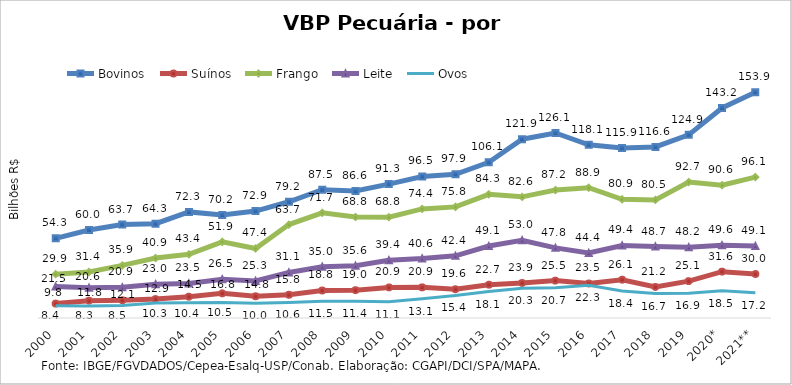
| Category | Bovinos | Suínos | Frango | Leite | Ovos |
|---|---|---|---|---|---|
| 2000 | 54.309 | 9.833 | 29.884 | 21.451 | 8.387 |
| 2001 | 60.033 | 11.797 | 31.41 | 20.642 | 8.265 |
| 2002 | 63.707 | 12.091 | 35.854 | 20.902 | 8.515 |
| 2003 | 64.297 | 12.923 | 40.876 | 23.018 | 10.3 |
| 2004 | 72.342 | 14.529 | 43.405 | 23.525 | 10.439 |
| 2005 | 70.233 | 16.845 | 51.893 | 26.459 | 10.51 |
| 2006 | 72.919 | 14.818 | 47.407 | 25.273 | 9.984 |
| 2007 | 79.247 | 15.845 | 63.696 | 31.069 | 10.611 |
| 2008 | 87.498 | 18.762 | 71.701 | 34.951 | 11.459 |
| 2009 | 86.585 | 18.965 | 68.843 | 35.633 | 11.426 |
| 2010 | 91.287 | 20.864 | 68.76 | 39.352 | 11.113 |
| 2011 | 96.504 | 20.896 | 74.367 | 40.567 | 13.095 |
| 2012 | 97.943 | 19.621 | 75.755 | 42.391 | 15.35 |
| 2013 | 106.135 | 22.718 | 84.316 | 49.055 | 18.054 |
| 2014 | 121.93 | 23.861 | 82.611 | 52.973 | 20.284 |
| 2015 | 126.126 | 25.5 | 87.212 | 47.817 | 20.654 |
| 2016 | 118.06 | 23.533 | 88.863 | 44.369 | 22.266 |
| 2017 | 115.856 | 26.124 | 80.938 | 49.436 | 18.353 |
| 2018 | 116.632 | 21.157 | 80.497 | 48.701 | 16.689 |
| 2019 | 124.887 | 25.147 | 92.684 | 48.25 | 16.902 |
| 2020* | 143.19 | 31.597 | 90.555 | 49.554 | 18.526 |
| 2021** | 153.864 | 29.992 | 96.087 | 49.074 | 17.166 |